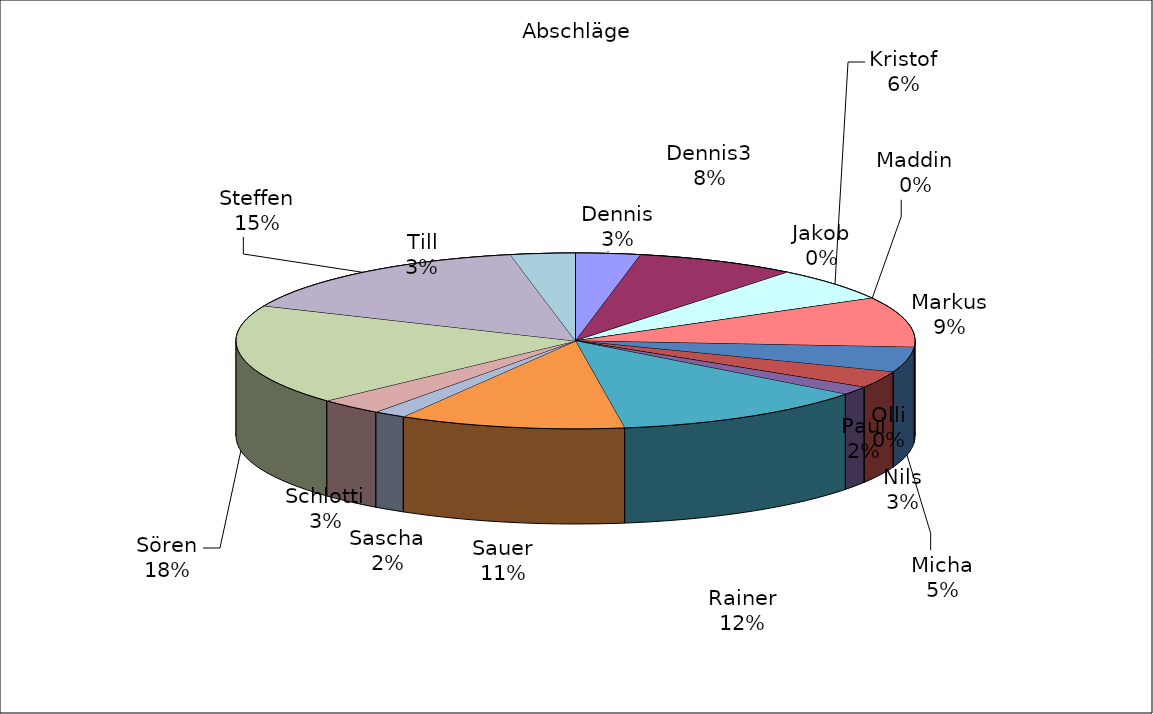
| Category | Series 0 |
|---|---|
| Dennis | 2 |
| Dennis3 | 5 |
| Jakob | 0 |
| Kristof | 4 |
| Maddin | 0 |
| Markus | 6 |
| Micha | 3 |
| Nils | 2 |
| Olli | 0 |
| Paul | 1 |
| Rainer | 8 |
| Sauer | 7 |
| Sascha | 1 |
| Schlotti | 2 |
| Sören | 12 |
| Steffen | 10 |
| Till | 2 |